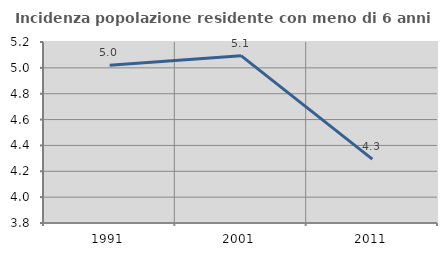
| Category | Incidenza popolazione residente con meno di 6 anni |
|---|---|
| 1991.0 | 5.02 |
| 2001.0 | 5.094 |
| 2011.0 | 4.294 |